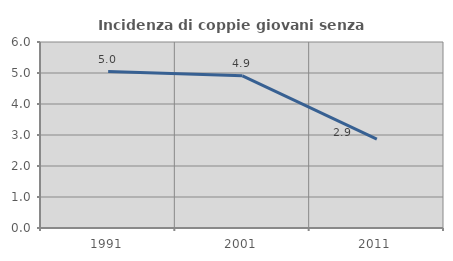
| Category | Incidenza di coppie giovani senza figli |
|---|---|
| 1991.0 | 5.045 |
| 2001.0 | 4.908 |
| 2011.0 | 2.865 |